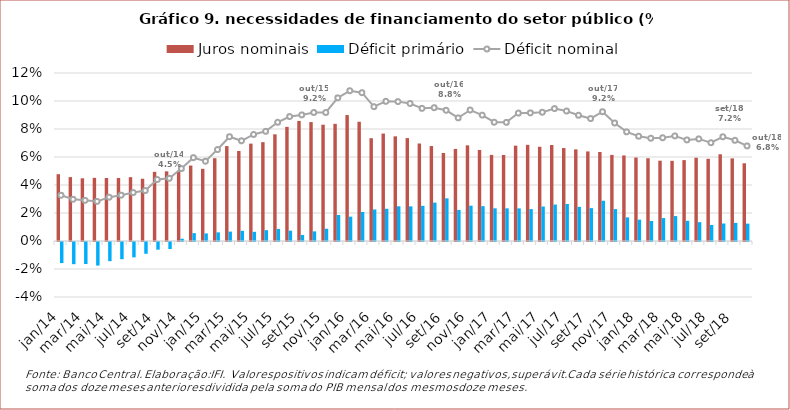
| Category | Juros nominais | Déficit primário |
|---|---|---|
| jan/14 | 0.048 | -0.015 |
| fev/14 | 0.046 | -0.016 |
| mar/14 | 0.045 | -0.016 |
| abr/14 | 0.045 | -0.017 |
| mai/14 | 0.045 | -0.014 |
| jun/14 | 0.045 | -0.012 |
| jul/14 | 0.046 | -0.011 |
| ago/14 | 0.044 | -0.008 |
| set/14 | 0.049 | -0.005 |
| out/14 | 0.05 | -0.005 |
| nov/14 | 0.05 | 0.002 |
| dez/14 | 0.054 | 0.006 |
| jan/15 | 0.052 | 0.005 |
| fev/15 | 0.059 | 0.006 |
| mar/15 | 0.068 | 0.007 |
| abr/15 | 0.064 | 0.007 |
| mai/15 | 0.07 | 0.007 |
| jun/15 | 0.071 | 0.008 |
| jul/15 | 0.076 | 0.009 |
| ago/15 | 0.082 | 0.007 |
| set/15 | 0.086 | 0.004 |
| out/15 | 0.085 | 0.007 |
| nov/15 | 0.083 | 0.009 |
| dez/15 | 0.084 | 0.019 |
| jan/16 | 0.09 | 0.017 |
| fev/16 | 0.085 | 0.021 |
| mar/16 | 0.073 | 0.023 |
| abr/16 | 0.077 | 0.023 |
| mai/16 | 0.075 | 0.025 |
| jun/16 | 0.073 | 0.025 |
| jul/16 | 0.07 | 0.025 |
| ago/16 | 0.068 | 0.027 |
| set/16 | 0.063 | 0.03 |
| out/16 | 0.066 | 0.022 |
| nov/16 | 0.068 | 0.025 |
| dez/16 | 0.065 | 0.025 |
| jan/17 | 0.061 | 0.023 |
| fev/17 | 0.061 | 0.023 |
| mar/17 | 0.068 | 0.023 |
| abr/17 | 0.069 | 0.023 |
| mai/17 | 0.067 | 0.025 |
| jun/17 | 0.069 | 0.026 |
| jul/17 | 0.066 | 0.026 |
| ago/17 | 0.065 | 0.024 |
| set/17 | 0.064 | 0.023 |
| out/17 | 0.064 | 0.029 |
| nov/17 | 0.061 | 0.023 |
| dez/17 | 0.061 | 0.017 |
| jan/18 | 0.06 | 0.015 |
| fev/18 | 0.059 | 0.014 |
| mar/18 | 0.057 | 0.016 |
| abr/18 | 0.057 | 0.018 |
| mai/18 | 0.058 | 0.014 |
| jun/18 | 0.059 | 0.013 |
| jul/18 | 0.059 | 0.011 |
| ago/18 | 0.062 | 0.012 |
| set/18 | 0.059 | 0.013 |
| out/18 | 0.056 | 0.012 |